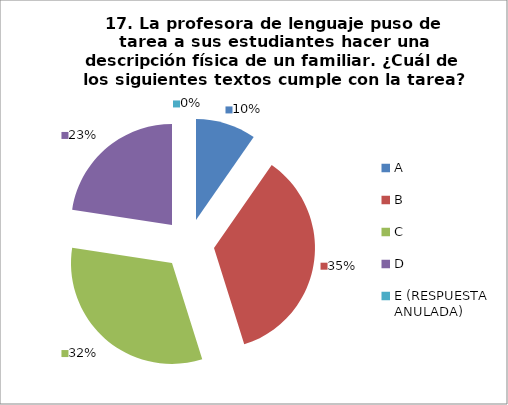
| Category | CANTIDAD DE RESPUESTAS PREGUNTA (17) | PORCENTAJE |
|---|---|---|
| A | 3 | 0.097 |
| B | 11 | 0.355 |
| C | 10 | 0.323 |
| D | 7 | 0.226 |
| E (RESPUESTA ANULADA) | 0 | 0 |